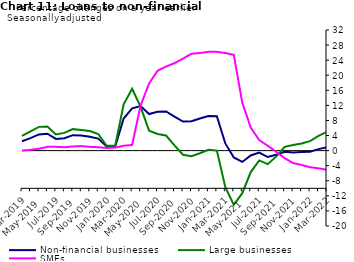
| Category | zero | Non-financial businesses | Large businesses | SMEs |
|---|---|---|---|---|
| Mar-2019 | 0 | 2.5 | 3.9 | 0 |
| Apr-2019 | 0 | 3.3 | 5.1 | 0.2 |
| May-2019 | 0 | 4.3 | 6.3 | 0.5 |
| Jun-2019 | 0 | 4.5 | 6.4 | 1 |
| Jul-2019 | 0 | 3.1 | 4.3 | 1 |
| Aug-2019 | 0 | 3.3 | 4.7 | 0.9 |
| Sep-2019 | 0 | 4.1 | 5.7 | 1.1 |
| Oct-2019 | 0 | 4 | 5.5 | 1.2 |
| Nov-2019 | 0 | 3.7 | 5.2 | 1 |
| Dec-2019 | 0 | 3.2 | 4.4 | 0.9 |
| Jan-2020 | 0 | 1.1 | 1.3 | 0.7 |
| Feb-2020 | 0 | 1.1 | 1.3 | 0.8 |
| Mar-2020 | 0 | 8.5 | 12.3 | 1.3 |
| Apr-2020 | 0 | 11.2 | 16.4 | 1.5 |
| May-2020 | 0 | 11.8 | 11.6 | 12 |
| Jun-2020 | 0 | 9.7 | 5.3 | 17.8 |
| Jul-2020 | 0 | 10.3 | 4.4 | 21.2 |
| Aug-2020 | 0 | 10.4 | 4 | 22.3 |
| Sep-2020 | 0 | 9 | 1.4 | 23.2 |
| Oct-2020 | 0 | 7.7 | -1.1 | 24.4 |
| Nov-2020 | 0 | 7.8 | -1.5 | 25.7 |
| Dec-2020 | 0 | 8.5 | -0.7 | 25.9 |
| Jan-2021 | 0 | 9.2 | 0.2 | 26.2 |
| Feb-2021 | 0 | 9.1 | 0 | 26.2 |
| Mar-2021 | 0 | 1.9 | -9.7 | 25.9 |
| Apr-2021 | 0 | -1.8 | -14.4 | 25.4 |
| May-2021 | 0 | -3 | -11.3 | 12.7 |
| Jun-2021 | 0 | -1.3 | -5.7 | 6.1 |
| Jul-2021 | 0 | -0.5 | -2.6 | 2.8 |
| Aug-2021 | 0 | -1.7 | -3.6 | 1.3 |
| Sep-2021 | 0 | -1.1 | -1.6 | -0.3 |
| Oct-2021 | 0 | -0.3 | 1 | -2 |
| Nov-2021 | 0 | -0.5 | 1.5 | -3.3 |
| Dec-2021 | 0 | -0.4 | 1.9 | -3.8 |
| Jan-2022 | 0 | -0.3 | 2.5 | -4.4 |
| Feb-2022 | 0 | 0.4 | 3.9 | -4.7 |
| Mar-2022 | 0 | 0.9 | 5 | -5.1 |